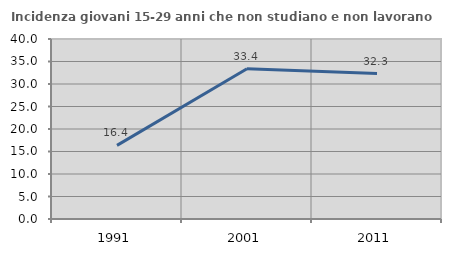
| Category | Incidenza giovani 15-29 anni che non studiano e non lavorano  |
|---|---|
| 1991.0 | 16.368 |
| 2001.0 | 33.375 |
| 2011.0 | 32.319 |